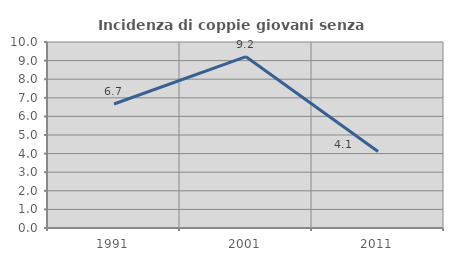
| Category | Incidenza di coppie giovani senza figli |
|---|---|
| 1991.0 | 6.667 |
| 2001.0 | 9.211 |
| 2011.0 | 4.11 |